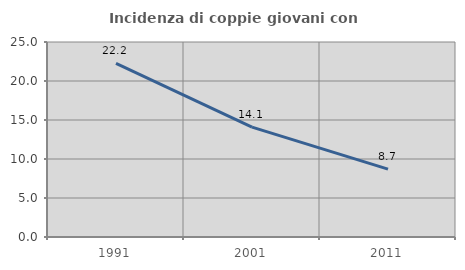
| Category | Incidenza di coppie giovani con figli |
|---|---|
| 1991.0 | 22.249 |
| 2001.0 | 14.088 |
| 2011.0 | 8.696 |